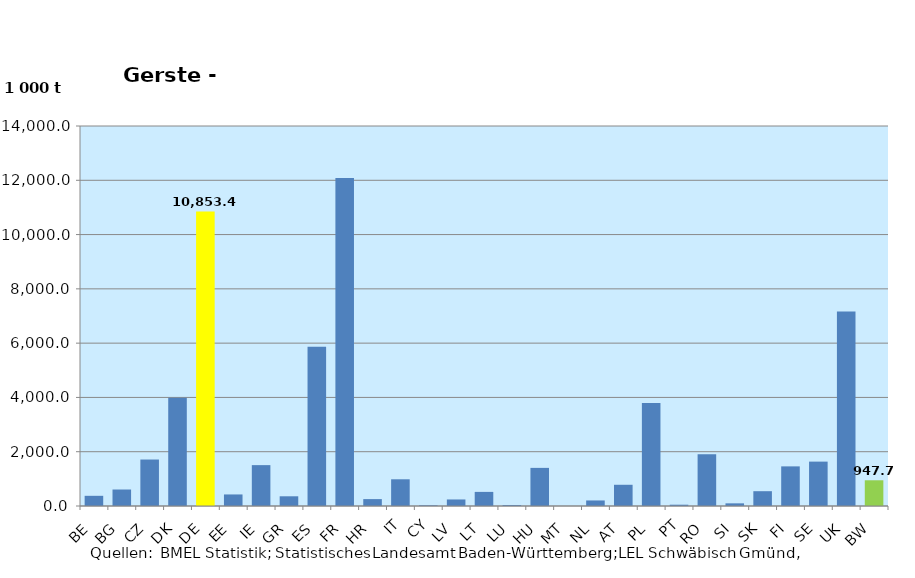
| Category | Gerste - 2017 |
|---|---|
| BE | 375.07 |
| BG | 607.66 |
| CZ | 1712.28 |
| DK | 3992.3 |
| DE | 10853.4 |
| EE | 425.68 |
| IE | 1505.83 |
| GR | 357.94 |
| ES | 5862.59 |
| FR | 12085.15 |
| HR | 254 |
| IT | 984.28 |
| CY | 25.8 |
| LV | 240.9 |
| LT | 519.73 |
| LU | 34.95 |
| HU | 1404.36 |
| MT | 0 |
| NL | 204.32 |
| AT | 782.03 |
| PL | 3793.03 |
| PT | 47.86 |
| RO | 1906.7 |
| SI | 97.93 |
| SK | 545.28 |
| FI | 1460.1 |
| SE | 1635.2 |
| UK | 7169 |
| BW | 947.684 |